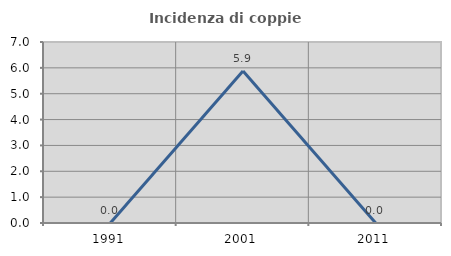
| Category | Incidenza di coppie miste |
|---|---|
| 1991.0 | 0 |
| 2001.0 | 5.882 |
| 2011.0 | 0 |